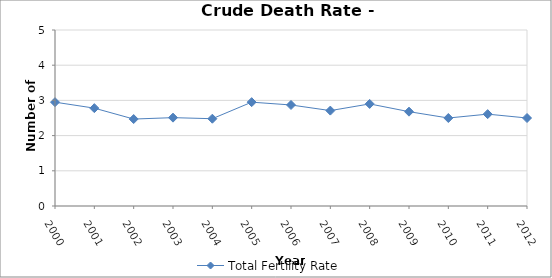
| Category | Total Fertility Rate |
|---|---|
| 2000.0 | 2.95 |
| 2001.0 | 2.78 |
| 2002.0 | 2.47 |
| 2003.0 | 2.51 |
| 2004.0 | 2.48 |
| 2005.0 | 2.95 |
| 2006.0 | 2.87 |
| 2007.0 | 2.71 |
| 2008.0 | 2.9 |
| 2009.0 | 2.68 |
| 2010.0 | 2.5 |
| 2011.0 | 2.61 |
| 2012.0 | 2.5 |